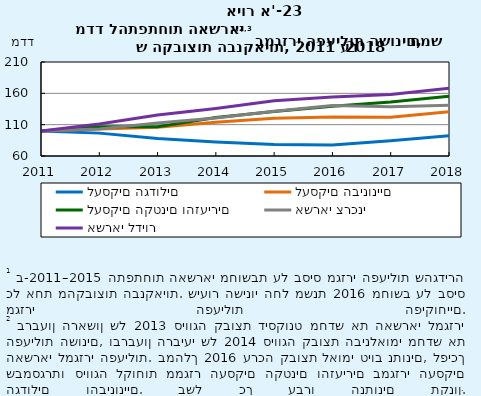
| Category | לעסקים הגדולים | לעסקים הבינוניים | לעסקים הקטנים והזעירים | אשראי צרכני | אשראי לדיור |
|---|---|---|---|---|---|
| 2011-12-31 | 100 | 100 | 100 | 100 | 100 |
| 2012-12-31 | 96.502 | 103.141 | 106.709 | 103.124 | 110.985 |
| 2013-12-31 | 88.018 | 105.772 | 106.708 | 112.807 | 125.283 |
| 2014-12-31 | 82.47 | 113.932 | 121.385 | 120.687 | 135.645 |
| 2015-12-31 | 78.197 | 120.351 | 130.95 | 131.561 | 148.007 |
| 2016-12-31 | 77.54 | 122.337 | 139.376 | 140.645 | 153.961 |
| 2017-12-31 | 84.351 | 121.754 | 146.259 | 138.535 | 158.002 |
| 2018-12-31 | 92.441 | 130.56 | 155.26 | 141.184 | 168.152 |